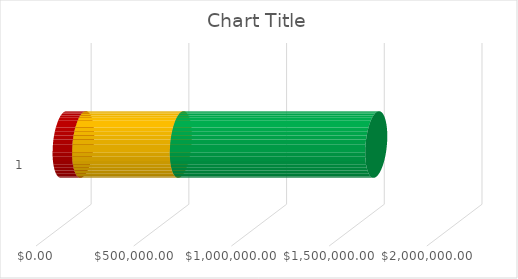
| Category | First Layer (Retention) | Second Layer | Third Layer |
|---|---|---|---|
| 0 | 100000 | 500000 | 1000000 |